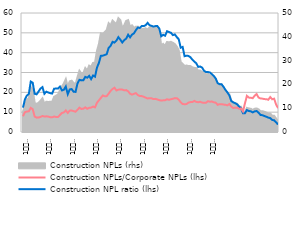
| Category | Construction NPL ratio (lhs) | Construction NPLs/Corporate NPLs (lhs) |
|---|---|---|
|  | 12.298 | 7.953 |
|  | 16.411 | 9.964 |
|  | 18.367 | 10.307 |
|  | 19.169 | 10.429 |
| 6
2009 | 25.433 | 12.171 |
|  | 24.835 | 11.492 |
|  | 19.256 | 7.802 |
|  | 18.981 | 7.244 |
|  | 20.435 | 7.307 |
|  | 21.895 | 7.598 |
| 12 | 22.645 | 8.082 |
| 1
2010 | 19.291 | 7.791 |
|  | 20.325 | 7.901 |
|  | 19.909 | 7.77 |
|  | 19.587 | 7.459 |
|  | 19.384 | 7.403 |
| 6
2010 | 21.841 | 7.803 |
|  | 21.9 | 7.569 |
|  | 21.893 | 7.585 |
|  | 22.897 | 8.602 |
|  | 20.957 | 9.578 |
|  | 21.316 | 9.883 |
| 12 | 22.951 | 10.902 |
| 1
2011 | 19.044 | 9.605 |
|  | 21.464 | 10.773 |
|  | 21.647 | 10.817 |
|  | 20.33 | 10.537 |
|  | 20.222 | 10.213 |
| 6
2011 | 24.486 | 11.167 |
|  | 26.307 | 12.286 |
|  | 26.025 | 11.63 |
|  | 26.069 | 11.734 |
|  | 27.804 | 12.439 |
|  | 27.388 | 11.715 |
| 12 | 28.322 | 12.235 |
| 1
2012 | 26.666 | 12.303 |
|  | 28.495 | 12.822 |
|  | 27.903 | 12.414 |
|  | 32.444 | 14.729 |
|  | 34.841 | 15.967 |
| 6
2012 | 38.393 | 17.166 |
|  | 38.504 | 18.425 |
|  | 38.824 | 18.02 |
|  | 39.218 | 18.083 |
|  | 42.401 | 19.329 |
|  | 43.421 | 20.716 |
| 12 | 45.464 | 21.691 |
| 1
2013 | 45.077 | 22.315 |
|  | 46.093 | 20.946 |
|  | 47.827 | 21.339 |
|  | 46.562 | 21.484 |
|  | 45.129 | 21.378 |
| 6
2013 | 46.309 | 20.985 |
|  | 47.078 | 21.124 |
|  | 49.061 | 20.535 |
|  | 47.719 | 19.305 |
|  | 49.11 | 18.858 |
|  | 49.753 | 19.235 |
| 12 | 51.351 | 19.613 |
| 1
2014 | 52.672 | 18.623 |
|  | 52.459 | 18.13 |
|  | 53.449 | 18.092 |
|  | 53.4 | 17.773 |
|  | 53.814 | 17.325 |
| 6
2014 | 55.031 | 16.909 |
|  | 53.856 | 17.062 |
|  | 53.532 | 17.007 |
|  | 53.153 | 16.589 |
|  | 53.392 | 16.713 |
|  | 53.438 | 16.409 |
| 12 | 52.2 | 16.064 |
| 1
2015 | 48.26 | 15.867 |
|  | 48.994 | 15.97 |
|  | 48.54 | 16.023 |
|  | 50.819 | 16.5 |
|  | 50.398 | 16.224 |
| 6
2015 | 50.034 | 16.529 |
|  | 48.852 | 16.755 |
|  | 49.2 | 17.08 |
|  | 47.851 | 17.074 |
|  | 46.8 | 16.302 |
|  | 42.497 | 15.02 |
| 12 | 42.897 | 14.115 |
| 1
2016 | 38.217 | 14.005 |
|  | 38.481 | 14.086 |
|  | 38.357 | 14.828 |
|  | 37.683 | 15.073 |
|  | 36.469 | 15.098 |
| 6
2016 | 35.485 | 15.671 |
|  | 34.686 | 15.189 |
|  | 32.812 | 15.006 |
|  | 33.031 | 15.257 |
|  | 32.472 | 14.824 |
|  | 30.854 | 14.772 |
| 12 | 30.237 | 14.756 |
| 1
2017 | 30.25 | 15.536 |
|  | 30.017 | 15.275 |
|  | 29.166 | 15.356 |
|  | 28.279 | 14.979 |
|  | 26.947 | 14.796 |
| 6
2017 | 24.631 | 13.709 |
|  | 24.106 | 14.046 |
|  | 24.082 | 14.052 |
|  | 22.783 | 13.837 |
|  | 21.226 | 13.72 |
|  | 19.97 | 13.447 |
| 12 | 18.452 | 14.114 |
| 1
2018 | 15.625 | 12.822 |
|  | 14.94 | 12.128 |
|  | 14.54 | 12.227 |
|  | 13.92 | 12.239 |
|  | 12.85 | 11.727 |
| 6
2018 | 11.9 | 11.834 |
|  | 9.5 | 10.392 |
|  | 9.47 | 14.361 |
|  | 11.06 | 18.232 |
|  | 10.59 | 17.345 |
|  | 10.44 | 17.269 |
| 12 | 9.88 | 17.028 |
| 1
2019 | 10.41 | 18.313 |
|  | 10.579 | 19.133 |
|  | 9.755 | 17.365 |
|  | 8.609 | 16.93 |
|  | 8.463 | 16.813 |
| 6
2019 | 8.06 | 16.583 |
|  | 7.693 | 16.56 |
|  | 7.264 | 16.26 |
|  | 7.001 | 17.614 |
|  | 6.068 | 16.511 |
|  | 5.909 | 16.838 |
| 12 | 4.879 | 13.922 |